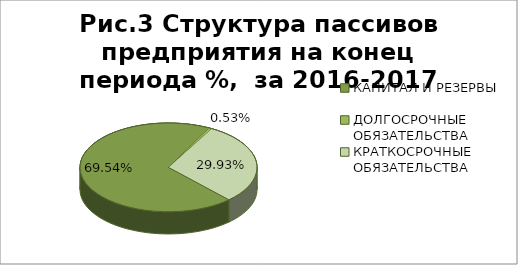
| Category | уд. вес. %,  за 2016-2017 г. |
|---|---|
| КАПИТАЛ И РЕЗЕРВЫ | 0.695 |
| ДОЛГОСРОЧНЫЕ ОБЯЗАТЕЛЬСТВА | 0.005 |
| КРАТКОСРОЧНЫЕ ОБЯЗАТЕЛЬСТВА | 0.299 |